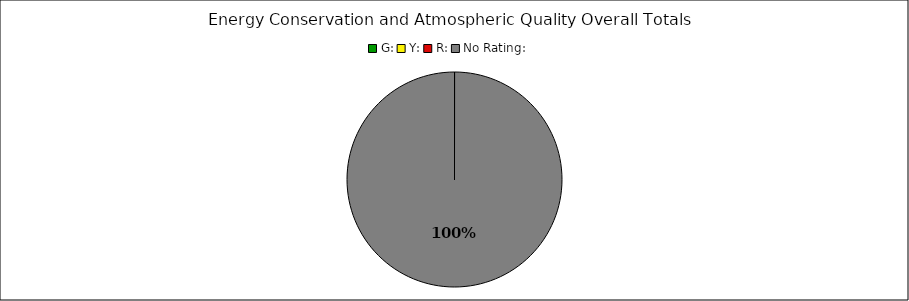
| Category | Series 0 |
|---|---|
| G: | 0 |
| Y: | 0 |
| R: | 0 |
| No Rating: | 8 |